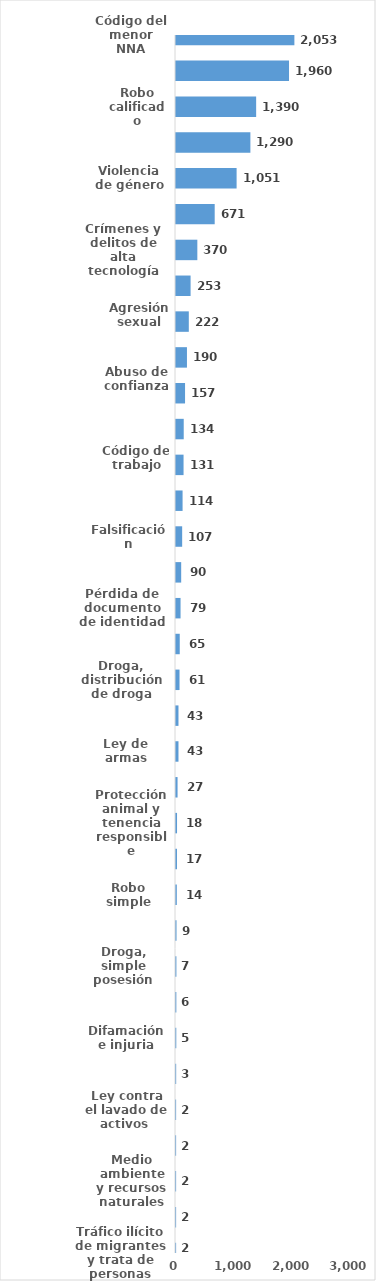
| Category | Series 0 |
|---|---|
| Código del menor NNA | 2053 |
| Violencia intrafamiliar | 1960 |
| Robo calificado | 1390 |
| Golpes y heridas | 1290 |
| Violencia de género | 1051 |
| Amenaza | 671 |
| Crímenes y delitos de alta tecnología | 370 |
| Daños y perjuicios a la cosa ajena | 253 |
| Agresión sexual | 222 |
| Estafa | 190 |
| Abuso de confianza | 157 |
| Conflictos sociales | 134 |
| Código de trabajo | 131 |
| Droga, traficante de droga | 114 |
| Falsificación | 107 |
| Asociación de malhechores | 90 |
| Pérdida de documento de identidad | 79 |
| Violación sexual | 65 |
| Droga, distribución de droga | 61 |
| Homicidio | 43 |
| Ley de armas | 43 |
| Desaparición | 27 |
| Protección animal y tenencia responsible | 18 |
| Crímenes y delitos contra la propiedad | 17 |
| Robo simple | 14 |
| Tentativa de homicidio | 9 |
| Droga, simple posesión | 7 |
| Tránsito y seguridad vial  | 6 |
| Difamación e injuria | 5 |
| Propiedad industrial, intelectual y derecho de autor | 3 |
| Ley contra el lavado de activos  | 2 |
| Ley de cheque | 2 |
| Medio ambiente y recursos naturales | 2 |
| Proxenetismo | 2 |
| Tráfico ilícito de migrantes y trata de personas | 2 |